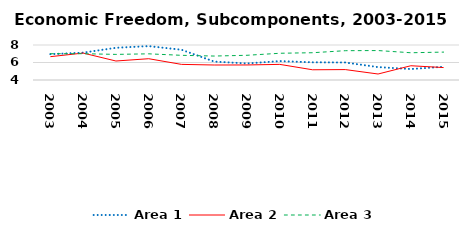
| Category | Area 1 | Area 2 | Area 3 |
|---|---|---|---|
| 2003.0 | 6.949 | 6.668 | 7.002 |
| 2004.0 | 7.125 | 7.075 | 7.006 |
| 2005.0 | 7.682 | 6.17 | 6.926 |
| 2006.0 | 7.873 | 6.433 | 6.991 |
| 2007.0 | 7.458 | 5.786 | 6.821 |
| 2008.0 | 6.106 | 5.713 | 6.737 |
| 2009.0 | 5.89 | 5.719 | 6.825 |
| 2010.0 | 6.162 | 5.785 | 7.056 |
| 2011.0 | 6.021 | 5.169 | 7.117 |
| 2012.0 | 6.001 | 5.189 | 7.35 |
| 2013.0 | 5.473 | 4.685 | 7.365 |
| 2014.0 | 5.251 | 5.629 | 7.114 |
| 2015.0 | 5.512 | 5.42 | 7.188 |